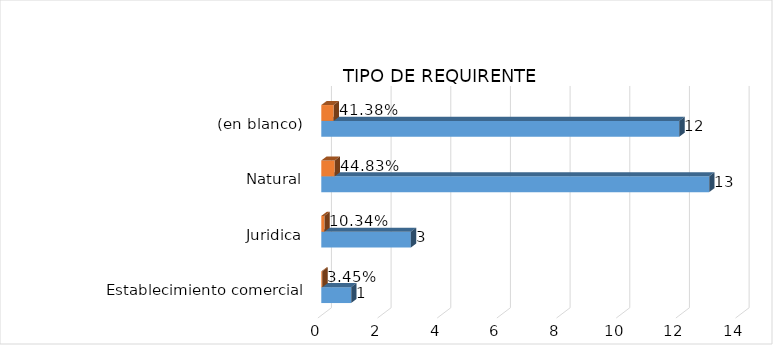
| Category | Cuenta de Número petición | Cuenta de Número petición2 |
|---|---|---|
| Establecimiento comercial | 1 | 0.034 |
| Juridica | 3 | 0.103 |
| Natural | 13 | 0.448 |
| (en blanco) | 12 | 0.414 |